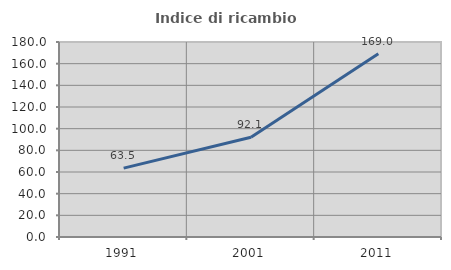
| Category | Indice di ricambio occupazionale  |
|---|---|
| 1991.0 | 63.549 |
| 2001.0 | 92.097 |
| 2011.0 | 169.048 |